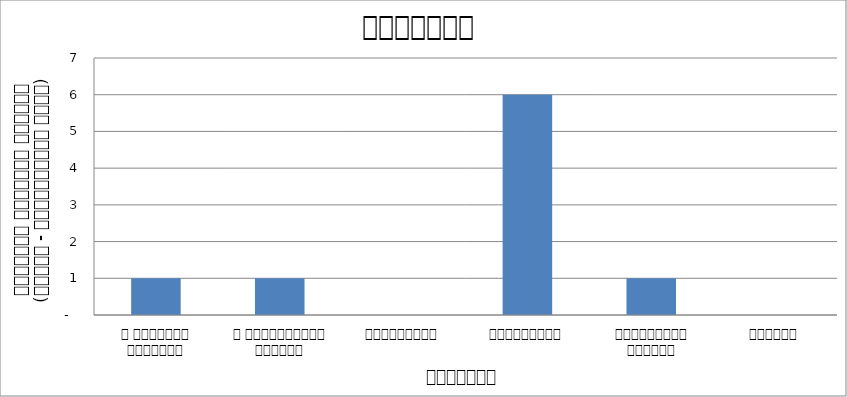
| Category | वातावरण |
|---|---|
| द हिमालयन टाइम्स् | 1 |
| द काठमाण्डौं पोस्ट् | 1 |
| रिपब्लिका | 0 |
| कान्तिपुर | 6 |
| अन्नपूर्ण पोस्ट् | 1 |
| नागरिक | 0 |